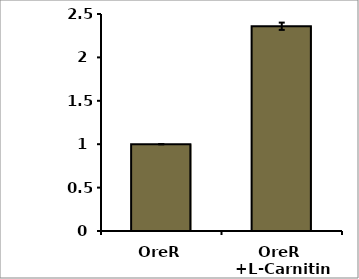
| Category | Series 0 |
|---|---|
| OreR | 1 |
| OreR  +L-Carnitine | 2.359 |